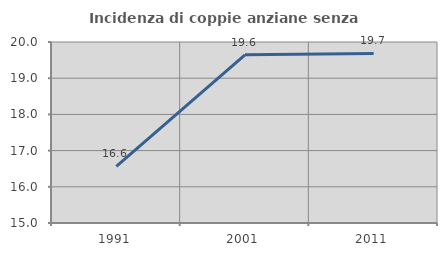
| Category | Incidenza di coppie anziane senza figli  |
|---|---|
| 1991.0 | 16.567 |
| 2001.0 | 19.647 |
| 2011.0 | 19.683 |